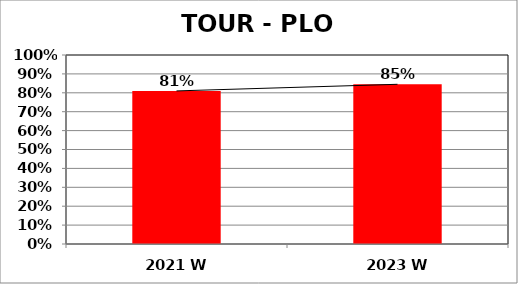
| Category | Series 0 |
|---|---|
| 2021 W | 0.81 |
| 2023 W | 0.845 |